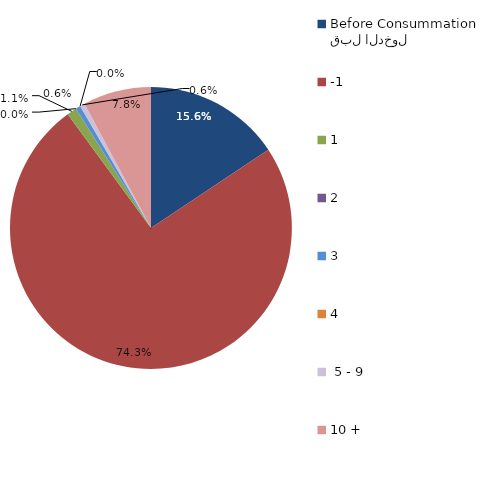
| Category | Series 0 |
|---|---|
| قبل الدخول
Before Consummation | 15.642 |
| -1 | 74.302 |
| 1 | 1.117 |
| 2 | 0 |
| 3 | 0.559 |
| 4 | 0 |
|  5 - 9 | 0.559 |
| 10 + | 7.821 |